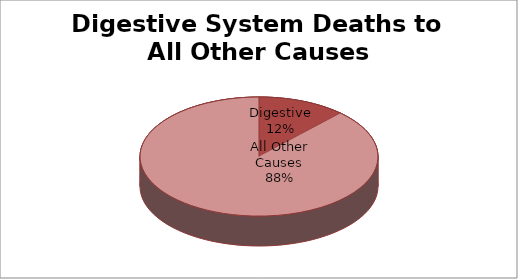
| Category | Series 0 |
|---|---|
| Digestive | 3 |
| All Other Causes | 22 |